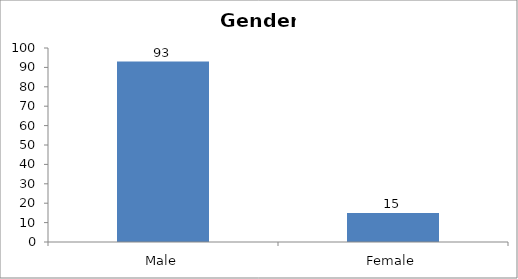
| Category | Gender |
|---|---|
| Male | 93 |
| Female | 15 |